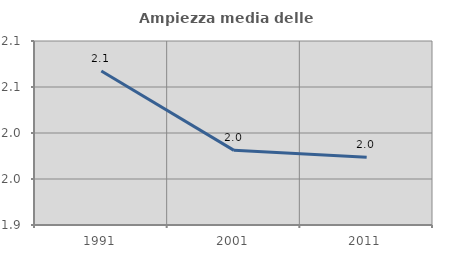
| Category | Ampiezza media delle famiglie |
|---|---|
| 1991.0 | 2.067 |
| 2001.0 | 1.981 |
| 2011.0 | 1.974 |